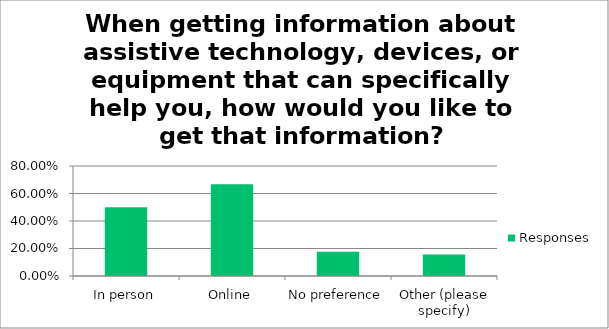
| Category | Responses |
|---|---|
| In person | 0.5 |
| Online | 0.667 |
| No preference | 0.177 |
| Other (please specify) | 0.156 |